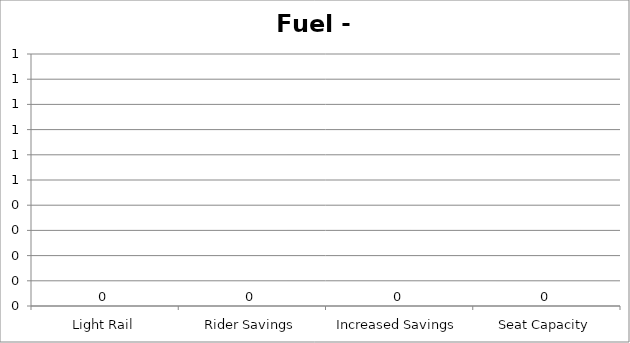
| Category | Fuel - GGE |
|---|---|
| Light Rail | 0 |
| Rider Savings | 0 |
| Increased Savings | 0 |
| Seat Capacity | 0 |